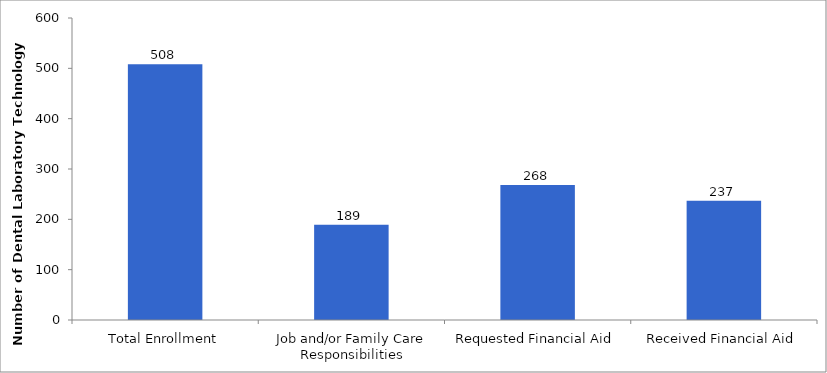
| Category | Series 0 |
|---|---|
| Total Enrollment | 508 |
| Job and/or Family Care Responsibilities | 189 |
| Requested Financial Aid | 268 |
| Received Financial Aid | 237 |